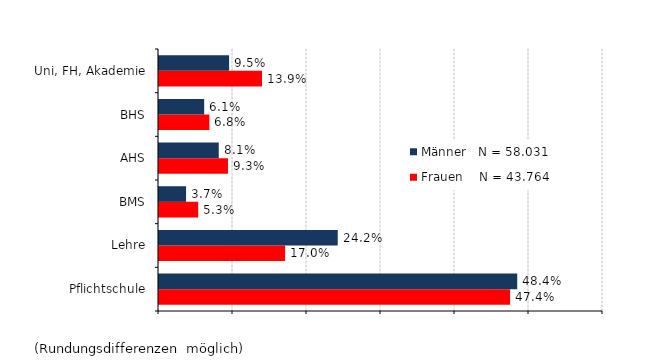
| Category | Frauen    N = 43.764 | Männer   N = 58.031 |
|---|---|---|
| Pflichtschule | 0.474 | 0.484 |
| Lehre | 0.17 | 0.242 |
| BMS | 0.053 | 0.037 |
| AHS | 0.093 | 0.081 |
| BHS | 0.068 | 0.061 |
| Uni, FH, Akademie | 0.139 | 0.095 |